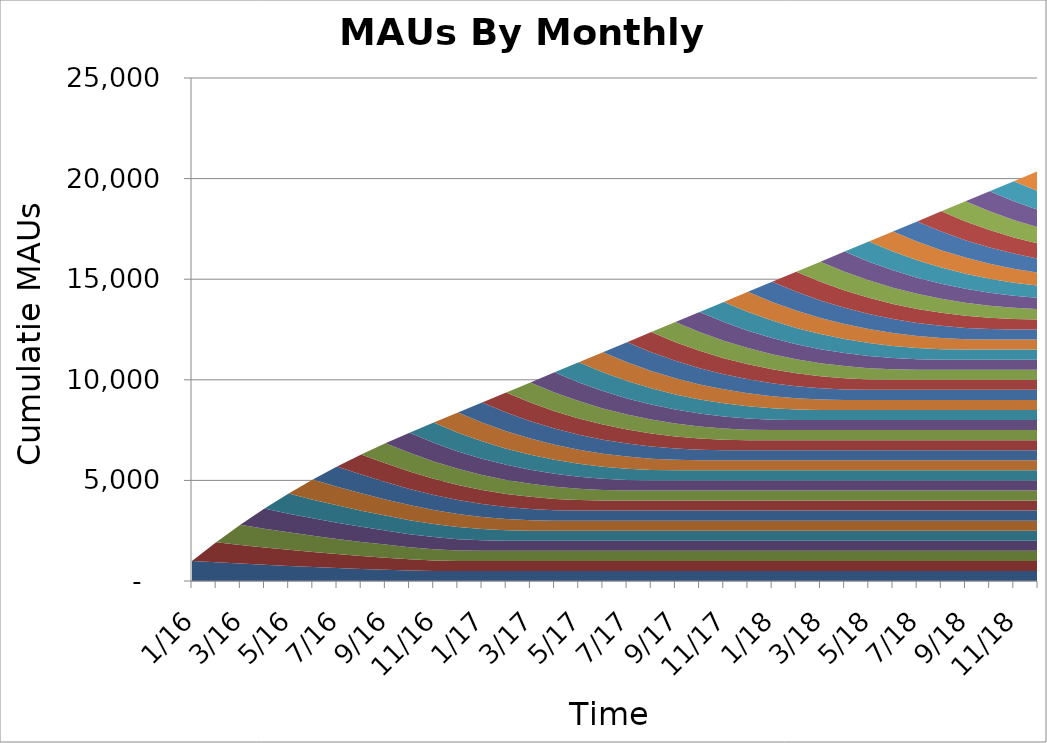
| Category | 1/1/16 | 2/1/16 | 3/1/16 | 4/1/16 | 5/1/16 | 6/1/16 | 7/1/16 | 8/1/16 | 9/1/16 | 10/1/16 | 11/1/16 | 12/1/16 | 1/1/17 | 2/1/17 | 3/1/17 | 4/1/17 | 5/1/17 | 6/1/17 | 7/1/17 | 8/1/17 | 9/1/17 | 10/1/17 | 11/1/17 | 12/1/17 | 1/1/18 | 2/1/18 | 3/1/18 | 4/1/18 | 5/1/18 | 6/1/18 | 7/1/18 | 8/1/18 | 9/1/18 | 10/1/18 | 11/1/18 | 12/1/18 | 1/1/19 | 2/1/19 | 3/1/19 | 4/1/19 | 5/1/19 | 6/1/19 | 7/1/19 | 8/1/19 | 9/1/19 | 10/1/19 | 11/1/19 | 12/1/19 | 1/1/20 | 2/1/20 | 3/1/20 | 4/1/20 | 5/1/20 | 6/1/20 | 7/1/20 | 8/1/20 | 9/1/20 | 10/1/20 | 11/1/20 | 12/1/20 | 1/1/21 | 2/1/21 | 3/1/21 | 4/1/21 | 5/1/21 | 6/1/21 | 7/1/21 | 8/1/21 | 9/1/21 | 10/1/21 | 11/1/21 | 12/1/21 | 1/1/22 | 2/1/22 | 3/1/22 | 4/1/22 | 5/1/22 | 6/1/22 | 7/1/22 | 8/1/22 | 9/1/22 | 10/1/22 | 11/1/22 | 12/1/22 |
|---|---|---|---|---|---|---|---|---|---|---|---|---|---|---|---|---|---|---|---|---|---|---|---|---|---|---|---|---|---|---|---|---|---|---|---|---|---|---|---|---|---|---|---|---|---|---|---|---|---|---|---|---|---|---|---|---|---|---|---|---|---|---|---|---|---|---|---|---|---|---|---|---|---|---|---|---|---|---|---|---|---|---|---|---|
| 2016-01-01 | 1000 | 0 | 0 | 0 | 0 | 0 | 0 | 0 | 0 | 0 | 0 | 0 | 0 | 0 | 0 | 0 | 0 | 0 | 0 | 0 | 0 | 0 | 0 | 0 | 0 | 0 | 0 | 0 | 0 | 0 | 0 | 0 | 0 | 0 | 0 | 0 | 0 | 0 | 0 | 0 | 0 | 0 | 0 | 0 | 0 | 0 | 0 | 0 | 0 | 0 | 0 | 0 | 0 | 0 | 0 | 0 | 0 | 0 | 0 | 0 | 0 | 0 | 0 | 0 | 0 | 0 | 0 | 0 | 0 | 0 | 0 | 0 | 0 | 0 | 0 | 0 | 0 | 0 | 0 | 0 | 0 | 0 | 0 | 0 |
| 2016-02-01 | 930 | 1000 | 0 | 0 | 0 | 0 | 0 | 0 | 0 | 0 | 0 | 0 | 0 | 0 | 0 | 0 | 0 | 0 | 0 | 0 | 0 | 0 | 0 | 0 | 0 | 0 | 0 | 0 | 0 | 0 | 0 | 0 | 0 | 0 | 0 | 0 | 0 | 0 | 0 | 0 | 0 | 0 | 0 | 0 | 0 | 0 | 0 | 0 | 0 | 0 | 0 | 0 | 0 | 0 | 0 | 0 | 0 | 0 | 0 | 0 | 0 | 0 | 0 | 0 | 0 | 0 | 0 | 0 | 0 | 0 | 0 | 0 | 0 | 0 | 0 | 0 | 0 | 0 | 0 | 0 | 0 | 0 | 0 | 0 |
| 2016-03-01 | 864.9 | 930 | 1000 | 0 | 0 | 0 | 0 | 0 | 0 | 0 | 0 | 0 | 0 | 0 | 0 | 0 | 0 | 0 | 0 | 0 | 0 | 0 | 0 | 0 | 0 | 0 | 0 | 0 | 0 | 0 | 0 | 0 | 0 | 0 | 0 | 0 | 0 | 0 | 0 | 0 | 0 | 0 | 0 | 0 | 0 | 0 | 0 | 0 | 0 | 0 | 0 | 0 | 0 | 0 | 0 | 0 | 0 | 0 | 0 | 0 | 0 | 0 | 0 | 0 | 0 | 0 | 0 | 0 | 0 | 0 | 0 | 0 | 0 | 0 | 0 | 0 | 0 | 0 | 0 | 0 | 0 | 0 | 0 | 0 |
| 2016-04-01 | 804.357 | 864.9 | 930 | 1000 | 0 | 0 | 0 | 0 | 0 | 0 | 0 | 0 | 0 | 0 | 0 | 0 | 0 | 0 | 0 | 0 | 0 | 0 | 0 | 0 | 0 | 0 | 0 | 0 | 0 | 0 | 0 | 0 | 0 | 0 | 0 | 0 | 0 | 0 | 0 | 0 | 0 | 0 | 0 | 0 | 0 | 0 | 0 | 0 | 0 | 0 | 0 | 0 | 0 | 0 | 0 | 0 | 0 | 0 | 0 | 0 | 0 | 0 | 0 | 0 | 0 | 0 | 0 | 0 | 0 | 0 | 0 | 0 | 0 | 0 | 0 | 0 | 0 | 0 | 0 | 0 | 0 | 0 | 0 | 0 |
| 2016-05-01 | 748.052 | 804.357 | 864.9 | 930 | 1000 | 0 | 0 | 0 | 0 | 0 | 0 | 0 | 0 | 0 | 0 | 0 | 0 | 0 | 0 | 0 | 0 | 0 | 0 | 0 | 0 | 0 | 0 | 0 | 0 | 0 | 0 | 0 | 0 | 0 | 0 | 0 | 0 | 0 | 0 | 0 | 0 | 0 | 0 | 0 | 0 | 0 | 0 | 0 | 0 | 0 | 0 | 0 | 0 | 0 | 0 | 0 | 0 | 0 | 0 | 0 | 0 | 0 | 0 | 0 | 0 | 0 | 0 | 0 | 0 | 0 | 0 | 0 | 0 | 0 | 0 | 0 | 0 | 0 | 0 | 0 | 0 | 0 | 0 | 0 |
| 2016-06-01 | 695.688 | 748.052 | 804.357 | 864.9 | 930 | 1000 | 0 | 0 | 0 | 0 | 0 | 0 | 0 | 0 | 0 | 0 | 0 | 0 | 0 | 0 | 0 | 0 | 0 | 0 | 0 | 0 | 0 | 0 | 0 | 0 | 0 | 0 | 0 | 0 | 0 | 0 | 0 | 0 | 0 | 0 | 0 | 0 | 0 | 0 | 0 | 0 | 0 | 0 | 0 | 0 | 0 | 0 | 0 | 0 | 0 | 0 | 0 | 0 | 0 | 0 | 0 | 0 | 0 | 0 | 0 | 0 | 0 | 0 | 0 | 0 | 0 | 0 | 0 | 0 | 0 | 0 | 0 | 0 | 0 | 0 | 0 | 0 | 0 | 0 |
| 2016-07-01 | 646.99 | 695.688 | 748.052 | 804.357 | 864.9 | 930 | 1000 | 0 | 0 | 0 | 0 | 0 | 0 | 0 | 0 | 0 | 0 | 0 | 0 | 0 | 0 | 0 | 0 | 0 | 0 | 0 | 0 | 0 | 0 | 0 | 0 | 0 | 0 | 0 | 0 | 0 | 0 | 0 | 0 | 0 | 0 | 0 | 0 | 0 | 0 | 0 | 0 | 0 | 0 | 0 | 0 | 0 | 0 | 0 | 0 | 0 | 0 | 0 | 0 | 0 | 0 | 0 | 0 | 0 | 0 | 0 | 0 | 0 | 0 | 0 | 0 | 0 | 0 | 0 | 0 | 0 | 0 | 0 | 0 | 0 | 0 | 0 | 0 | 0 |
| 2016-08-01 | 601.701 | 646.99 | 695.688 | 748.052 | 804.357 | 864.9 | 930 | 1000 | 0 | 0 | 0 | 0 | 0 | 0 | 0 | 0 | 0 | 0 | 0 | 0 | 0 | 0 | 0 | 0 | 0 | 0 | 0 | 0 | 0 | 0 | 0 | 0 | 0 | 0 | 0 | 0 | 0 | 0 | 0 | 0 | 0 | 0 | 0 | 0 | 0 | 0 | 0 | 0 | 0 | 0 | 0 | 0 | 0 | 0 | 0 | 0 | 0 | 0 | 0 | 0 | 0 | 0 | 0 | 0 | 0 | 0 | 0 | 0 | 0 | 0 | 0 | 0 | 0 | 0 | 0 | 0 | 0 | 0 | 0 | 0 | 0 | 0 | 0 | 0 |
| 2016-09-01 | 559.582 | 601.701 | 646.99 | 695.688 | 748.052 | 804.357 | 864.9 | 930 | 1000 | 0 | 0 | 0 | 0 | 0 | 0 | 0 | 0 | 0 | 0 | 0 | 0 | 0 | 0 | 0 | 0 | 0 | 0 | 0 | 0 | 0 | 0 | 0 | 0 | 0 | 0 | 0 | 0 | 0 | 0 | 0 | 0 | 0 | 0 | 0 | 0 | 0 | 0 | 0 | 0 | 0 | 0 | 0 | 0 | 0 | 0 | 0 | 0 | 0 | 0 | 0 | 0 | 0 | 0 | 0 | 0 | 0 | 0 | 0 | 0 | 0 | 0 | 0 | 0 | 0 | 0 | 0 | 0 | 0 | 0 | 0 | 0 | 0 | 0 | 0 |
| 2016-10-01 | 520.411 | 559.582 | 601.701 | 646.99 | 695.688 | 748.052 | 804.357 | 864.9 | 930 | 1000 | 0 | 0 | 0 | 0 | 0 | 0 | 0 | 0 | 0 | 0 | 0 | 0 | 0 | 0 | 0 | 0 | 0 | 0 | 0 | 0 | 0 | 0 | 0 | 0 | 0 | 0 | 0 | 0 | 0 | 0 | 0 | 0 | 0 | 0 | 0 | 0 | 0 | 0 | 0 | 0 | 0 | 0 | 0 | 0 | 0 | 0 | 0 | 0 | 0 | 0 | 0 | 0 | 0 | 0 | 0 | 0 | 0 | 0 | 0 | 0 | 0 | 0 | 0 | 0 | 0 | 0 | 0 | 0 | 0 | 0 | 0 | 0 | 0 | 0 |
| 2016-11-01 | 500 | 520.411 | 559.582 | 601.701 | 646.99 | 695.688 | 748.052 | 804.357 | 864.9 | 930 | 1000 | 0 | 0 | 0 | 0 | 0 | 0 | 0 | 0 | 0 | 0 | 0 | 0 | 0 | 0 | 0 | 0 | 0 | 0 | 0 | 0 | 0 | 0 | 0 | 0 | 0 | 0 | 0 | 0 | 0 | 0 | 0 | 0 | 0 | 0 | 0 | 0 | 0 | 0 | 0 | 0 | 0 | 0 | 0 | 0 | 0 | 0 | 0 | 0 | 0 | 0 | 0 | 0 | 0 | 0 | 0 | 0 | 0 | 0 | 0 | 0 | 0 | 0 | 0 | 0 | 0 | 0 | 0 | 0 | 0 | 0 | 0 | 0 | 0 |
| 2016-12-01 | 500 | 500 | 520.411 | 559.582 | 601.701 | 646.99 | 695.688 | 748.052 | 804.357 | 864.9 | 930 | 1000 | 0 | 0 | 0 | 0 | 0 | 0 | 0 | 0 | 0 | 0 | 0 | 0 | 0 | 0 | 0 | 0 | 0 | 0 | 0 | 0 | 0 | 0 | 0 | 0 | 0 | 0 | 0 | 0 | 0 | 0 | 0 | 0 | 0 | 0 | 0 | 0 | 0 | 0 | 0 | 0 | 0 | 0 | 0 | 0 | 0 | 0 | 0 | 0 | 0 | 0 | 0 | 0 | 0 | 0 | 0 | 0 | 0 | 0 | 0 | 0 | 0 | 0 | 0 | 0 | 0 | 0 | 0 | 0 | 0 | 0 | 0 | 0 |
| 2017-01-01 | 500 | 500 | 500 | 520.411 | 559.582 | 601.701 | 646.99 | 695.688 | 748.052 | 804.357 | 864.9 | 930 | 1000 | 0 | 0 | 0 | 0 | 0 | 0 | 0 | 0 | 0 | 0 | 0 | 0 | 0 | 0 | 0 | 0 | 0 | 0 | 0 | 0 | 0 | 0 | 0 | 0 | 0 | 0 | 0 | 0 | 0 | 0 | 0 | 0 | 0 | 0 | 0 | 0 | 0 | 0 | 0 | 0 | 0 | 0 | 0 | 0 | 0 | 0 | 0 | 0 | 0 | 0 | 0 | 0 | 0 | 0 | 0 | 0 | 0 | 0 | 0 | 0 | 0 | 0 | 0 | 0 | 0 | 0 | 0 | 0 | 0 | 0 | 0 |
| 2017-02-01 | 500 | 500 | 500 | 500 | 520.411 | 559.582 | 601.701 | 646.99 | 695.688 | 748.052 | 804.357 | 864.9 | 930 | 1000 | 0 | 0 | 0 | 0 | 0 | 0 | 0 | 0 | 0 | 0 | 0 | 0 | 0 | 0 | 0 | 0 | 0 | 0 | 0 | 0 | 0 | 0 | 0 | 0 | 0 | 0 | 0 | 0 | 0 | 0 | 0 | 0 | 0 | 0 | 0 | 0 | 0 | 0 | 0 | 0 | 0 | 0 | 0 | 0 | 0 | 0 | 0 | 0 | 0 | 0 | 0 | 0 | 0 | 0 | 0 | 0 | 0 | 0 | 0 | 0 | 0 | 0 | 0 | 0 | 0 | 0 | 0 | 0 | 0 | 0 |
| 2017-03-01 | 500 | 500 | 500 | 500 | 500 | 520.411 | 559.582 | 601.701 | 646.99 | 695.688 | 748.052 | 804.357 | 864.9 | 930 | 1000 | 0 | 0 | 0 | 0 | 0 | 0 | 0 | 0 | 0 | 0 | 0 | 0 | 0 | 0 | 0 | 0 | 0 | 0 | 0 | 0 | 0 | 0 | 0 | 0 | 0 | 0 | 0 | 0 | 0 | 0 | 0 | 0 | 0 | 0 | 0 | 0 | 0 | 0 | 0 | 0 | 0 | 0 | 0 | 0 | 0 | 0 | 0 | 0 | 0 | 0 | 0 | 0 | 0 | 0 | 0 | 0 | 0 | 0 | 0 | 0 | 0 | 0 | 0 | 0 | 0 | 0 | 0 | 0 | 0 |
| 2017-04-01 | 500 | 500 | 500 | 500 | 500 | 500 | 520.411 | 559.582 | 601.701 | 646.99 | 695.688 | 748.052 | 804.357 | 864.9 | 930 | 1000 | 0 | 0 | 0 | 0 | 0 | 0 | 0 | 0 | 0 | 0 | 0 | 0 | 0 | 0 | 0 | 0 | 0 | 0 | 0 | 0 | 0 | 0 | 0 | 0 | 0 | 0 | 0 | 0 | 0 | 0 | 0 | 0 | 0 | 0 | 0 | 0 | 0 | 0 | 0 | 0 | 0 | 0 | 0 | 0 | 0 | 0 | 0 | 0 | 0 | 0 | 0 | 0 | 0 | 0 | 0 | 0 | 0 | 0 | 0 | 0 | 0 | 0 | 0 | 0 | 0 | 0 | 0 | 0 |
| 2017-05-01 | 500 | 500 | 500 | 500 | 500 | 500 | 500 | 520.411 | 559.582 | 601.701 | 646.99 | 695.688 | 748.052 | 804.357 | 864.9 | 930 | 1000 | 0 | 0 | 0 | 0 | 0 | 0 | 0 | 0 | 0 | 0 | 0 | 0 | 0 | 0 | 0 | 0 | 0 | 0 | 0 | 0 | 0 | 0 | 0 | 0 | 0 | 0 | 0 | 0 | 0 | 0 | 0 | 0 | 0 | 0 | 0 | 0 | 0 | 0 | 0 | 0 | 0 | 0 | 0 | 0 | 0 | 0 | 0 | 0 | 0 | 0 | 0 | 0 | 0 | 0 | 0 | 0 | 0 | 0 | 0 | 0 | 0 | 0 | 0 | 0 | 0 | 0 | 0 |
| 2017-06-01 | 500 | 500 | 500 | 500 | 500 | 500 | 500 | 500 | 520.411 | 559.582 | 601.701 | 646.99 | 695.688 | 748.052 | 804.357 | 864.9 | 930 | 1000 | 0 | 0 | 0 | 0 | 0 | 0 | 0 | 0 | 0 | 0 | 0 | 0 | 0 | 0 | 0 | 0 | 0 | 0 | 0 | 0 | 0 | 0 | 0 | 0 | 0 | 0 | 0 | 0 | 0 | 0 | 0 | 0 | 0 | 0 | 0 | 0 | 0 | 0 | 0 | 0 | 0 | 0 | 0 | 0 | 0 | 0 | 0 | 0 | 0 | 0 | 0 | 0 | 0 | 0 | 0 | 0 | 0 | 0 | 0 | 0 | 0 | 0 | 0 | 0 | 0 | 0 |
| 2017-07-01 | 500 | 500 | 500 | 500 | 500 | 500 | 500 | 500 | 500 | 520.411 | 559.582 | 601.701 | 646.99 | 695.688 | 748.052 | 804.357 | 864.9 | 930 | 1000 | 0 | 0 | 0 | 0 | 0 | 0 | 0 | 0 | 0 | 0 | 0 | 0 | 0 | 0 | 0 | 0 | 0 | 0 | 0 | 0 | 0 | 0 | 0 | 0 | 0 | 0 | 0 | 0 | 0 | 0 | 0 | 0 | 0 | 0 | 0 | 0 | 0 | 0 | 0 | 0 | 0 | 0 | 0 | 0 | 0 | 0 | 0 | 0 | 0 | 0 | 0 | 0 | 0 | 0 | 0 | 0 | 0 | 0 | 0 | 0 | 0 | 0 | 0 | 0 | 0 |
| 2017-08-01 | 500 | 500 | 500 | 500 | 500 | 500 | 500 | 500 | 500 | 500 | 520.411 | 559.582 | 601.701 | 646.99 | 695.688 | 748.052 | 804.357 | 864.9 | 930 | 1000 | 0 | 0 | 0 | 0 | 0 | 0 | 0 | 0 | 0 | 0 | 0 | 0 | 0 | 0 | 0 | 0 | 0 | 0 | 0 | 0 | 0 | 0 | 0 | 0 | 0 | 0 | 0 | 0 | 0 | 0 | 0 | 0 | 0 | 0 | 0 | 0 | 0 | 0 | 0 | 0 | 0 | 0 | 0 | 0 | 0 | 0 | 0 | 0 | 0 | 0 | 0 | 0 | 0 | 0 | 0 | 0 | 0 | 0 | 0 | 0 | 0 | 0 | 0 | 0 |
| 2017-09-01 | 500 | 500 | 500 | 500 | 500 | 500 | 500 | 500 | 500 | 500 | 500 | 520.411 | 559.582 | 601.701 | 646.99 | 695.688 | 748.052 | 804.357 | 864.9 | 930 | 1000 | 0 | 0 | 0 | 0 | 0 | 0 | 0 | 0 | 0 | 0 | 0 | 0 | 0 | 0 | 0 | 0 | 0 | 0 | 0 | 0 | 0 | 0 | 0 | 0 | 0 | 0 | 0 | 0 | 0 | 0 | 0 | 0 | 0 | 0 | 0 | 0 | 0 | 0 | 0 | 0 | 0 | 0 | 0 | 0 | 0 | 0 | 0 | 0 | 0 | 0 | 0 | 0 | 0 | 0 | 0 | 0 | 0 | 0 | 0 | 0 | 0 | 0 | 0 |
| 2017-10-01 | 500 | 500 | 500 | 500 | 500 | 500 | 500 | 500 | 500 | 500 | 500 | 500 | 520.411 | 559.582 | 601.701 | 646.99 | 695.688 | 748.052 | 804.357 | 864.9 | 930 | 1000 | 0 | 0 | 0 | 0 | 0 | 0 | 0 | 0 | 0 | 0 | 0 | 0 | 0 | 0 | 0 | 0 | 0 | 0 | 0 | 0 | 0 | 0 | 0 | 0 | 0 | 0 | 0 | 0 | 0 | 0 | 0 | 0 | 0 | 0 | 0 | 0 | 0 | 0 | 0 | 0 | 0 | 0 | 0 | 0 | 0 | 0 | 0 | 0 | 0 | 0 | 0 | 0 | 0 | 0 | 0 | 0 | 0 | 0 | 0 | 0 | 0 | 0 |
| 2017-11-01 | 500 | 500 | 500 | 500 | 500 | 500 | 500 | 500 | 500 | 500 | 500 | 500 | 500 | 520.411 | 559.582 | 601.701 | 646.99 | 695.688 | 748.052 | 804.357 | 864.9 | 930 | 1000 | 0 | 0 | 0 | 0 | 0 | 0 | 0 | 0 | 0 | 0 | 0 | 0 | 0 | 0 | 0 | 0 | 0 | 0 | 0 | 0 | 0 | 0 | 0 | 0 | 0 | 0 | 0 | 0 | 0 | 0 | 0 | 0 | 0 | 0 | 0 | 0 | 0 | 0 | 0 | 0 | 0 | 0 | 0 | 0 | 0 | 0 | 0 | 0 | 0 | 0 | 0 | 0 | 0 | 0 | 0 | 0 | 0 | 0 | 0 | 0 | 0 |
| 2017-12-01 | 500 | 500 | 500 | 500 | 500 | 500 | 500 | 500 | 500 | 500 | 500 | 500 | 500 | 500 | 520.411 | 559.582 | 601.701 | 646.99 | 695.688 | 748.052 | 804.357 | 864.9 | 930 | 1000 | 0 | 0 | 0 | 0 | 0 | 0 | 0 | 0 | 0 | 0 | 0 | 0 | 0 | 0 | 0 | 0 | 0 | 0 | 0 | 0 | 0 | 0 | 0 | 0 | 0 | 0 | 0 | 0 | 0 | 0 | 0 | 0 | 0 | 0 | 0 | 0 | 0 | 0 | 0 | 0 | 0 | 0 | 0 | 0 | 0 | 0 | 0 | 0 | 0 | 0 | 0 | 0 | 0 | 0 | 0 | 0 | 0 | 0 | 0 | 0 |
| 2018-01-01 | 500 | 500 | 500 | 500 | 500 | 500 | 500 | 500 | 500 | 500 | 500 | 500 | 500 | 500 | 500 | 520.411 | 559.582 | 601.701 | 646.99 | 695.688 | 748.052 | 804.357 | 864.9 | 930 | 1000 | 0 | 0 | 0 | 0 | 0 | 0 | 0 | 0 | 0 | 0 | 0 | 0 | 0 | 0 | 0 | 0 | 0 | 0 | 0 | 0 | 0 | 0 | 0 | 0 | 0 | 0 | 0 | 0 | 0 | 0 | 0 | 0 | 0 | 0 | 0 | 0 | 0 | 0 | 0 | 0 | 0 | 0 | 0 | 0 | 0 | 0 | 0 | 0 | 0 | 0 | 0 | 0 | 0 | 0 | 0 | 0 | 0 | 0 | 0 |
| 2018-02-01 | 500 | 500 | 500 | 500 | 500 | 500 | 500 | 500 | 500 | 500 | 500 | 500 | 500 | 500 | 500 | 500 | 520.411 | 559.582 | 601.701 | 646.99 | 695.688 | 748.052 | 804.357 | 864.9 | 930 | 1000 | 0 | 0 | 0 | 0 | 0 | 0 | 0 | 0 | 0 | 0 | 0 | 0 | 0 | 0 | 0 | 0 | 0 | 0 | 0 | 0 | 0 | 0 | 0 | 0 | 0 | 0 | 0 | 0 | 0 | 0 | 0 | 0 | 0 | 0 | 0 | 0 | 0 | 0 | 0 | 0 | 0 | 0 | 0 | 0 | 0 | 0 | 0 | 0 | 0 | 0 | 0 | 0 | 0 | 0 | 0 | 0 | 0 | 0 |
| 2018-03-01 | 500 | 500 | 500 | 500 | 500 | 500 | 500 | 500 | 500 | 500 | 500 | 500 | 500 | 500 | 500 | 500 | 500 | 520.411 | 559.582 | 601.701 | 646.99 | 695.688 | 748.052 | 804.357 | 864.9 | 930 | 1000 | 0 | 0 | 0 | 0 | 0 | 0 | 0 | 0 | 0 | 0 | 0 | 0 | 0 | 0 | 0 | 0 | 0 | 0 | 0 | 0 | 0 | 0 | 0 | 0 | 0 | 0 | 0 | 0 | 0 | 0 | 0 | 0 | 0 | 0 | 0 | 0 | 0 | 0 | 0 | 0 | 0 | 0 | 0 | 0 | 0 | 0 | 0 | 0 | 0 | 0 | 0 | 0 | 0 | 0 | 0 | 0 | 0 |
| 2018-04-01 | 500 | 500 | 500 | 500 | 500 | 500 | 500 | 500 | 500 | 500 | 500 | 500 | 500 | 500 | 500 | 500 | 500 | 500 | 520.411 | 559.582 | 601.701 | 646.99 | 695.688 | 748.052 | 804.357 | 864.9 | 930 | 1000 | 0 | 0 | 0 | 0 | 0 | 0 | 0 | 0 | 0 | 0 | 0 | 0 | 0 | 0 | 0 | 0 | 0 | 0 | 0 | 0 | 0 | 0 | 0 | 0 | 0 | 0 | 0 | 0 | 0 | 0 | 0 | 0 | 0 | 0 | 0 | 0 | 0 | 0 | 0 | 0 | 0 | 0 | 0 | 0 | 0 | 0 | 0 | 0 | 0 | 0 | 0 | 0 | 0 | 0 | 0 | 0 |
| 2018-05-01 | 500 | 500 | 500 | 500 | 500 | 500 | 500 | 500 | 500 | 500 | 500 | 500 | 500 | 500 | 500 | 500 | 500 | 500 | 500 | 520.411 | 559.582 | 601.701 | 646.99 | 695.688 | 748.052 | 804.357 | 864.9 | 930 | 1000 | 0 | 0 | 0 | 0 | 0 | 0 | 0 | 0 | 0 | 0 | 0 | 0 | 0 | 0 | 0 | 0 | 0 | 0 | 0 | 0 | 0 | 0 | 0 | 0 | 0 | 0 | 0 | 0 | 0 | 0 | 0 | 0 | 0 | 0 | 0 | 0 | 0 | 0 | 0 | 0 | 0 | 0 | 0 | 0 | 0 | 0 | 0 | 0 | 0 | 0 | 0 | 0 | 0 | 0 | 0 |
| 2018-06-01 | 500 | 500 | 500 | 500 | 500 | 500 | 500 | 500 | 500 | 500 | 500 | 500 | 500 | 500 | 500 | 500 | 500 | 500 | 500 | 500 | 520.411 | 559.582 | 601.701 | 646.99 | 695.688 | 748.052 | 804.357 | 864.9 | 930 | 1000 | 0 | 0 | 0 | 0 | 0 | 0 | 0 | 0 | 0 | 0 | 0 | 0 | 0 | 0 | 0 | 0 | 0 | 0 | 0 | 0 | 0 | 0 | 0 | 0 | 0 | 0 | 0 | 0 | 0 | 0 | 0 | 0 | 0 | 0 | 0 | 0 | 0 | 0 | 0 | 0 | 0 | 0 | 0 | 0 | 0 | 0 | 0 | 0 | 0 | 0 | 0 | 0 | 0 | 0 |
| 2018-07-01 | 500 | 500 | 500 | 500 | 500 | 500 | 500 | 500 | 500 | 500 | 500 | 500 | 500 | 500 | 500 | 500 | 500 | 500 | 500 | 500 | 500 | 520.411 | 559.582 | 601.701 | 646.99 | 695.688 | 748.052 | 804.357 | 864.9 | 930 | 1000 | 0 | 0 | 0 | 0 | 0 | 0 | 0 | 0 | 0 | 0 | 0 | 0 | 0 | 0 | 0 | 0 | 0 | 0 | 0 | 0 | 0 | 0 | 0 | 0 | 0 | 0 | 0 | 0 | 0 | 0 | 0 | 0 | 0 | 0 | 0 | 0 | 0 | 0 | 0 | 0 | 0 | 0 | 0 | 0 | 0 | 0 | 0 | 0 | 0 | 0 | 0 | 0 | 0 |
| 2018-08-01 | 500 | 500 | 500 | 500 | 500 | 500 | 500 | 500 | 500 | 500 | 500 | 500 | 500 | 500 | 500 | 500 | 500 | 500 | 500 | 500 | 500 | 500 | 520.411 | 559.582 | 601.701 | 646.99 | 695.688 | 748.052 | 804.357 | 864.9 | 930 | 1000 | 0 | 0 | 0 | 0 | 0 | 0 | 0 | 0 | 0 | 0 | 0 | 0 | 0 | 0 | 0 | 0 | 0 | 0 | 0 | 0 | 0 | 0 | 0 | 0 | 0 | 0 | 0 | 0 | 0 | 0 | 0 | 0 | 0 | 0 | 0 | 0 | 0 | 0 | 0 | 0 | 0 | 0 | 0 | 0 | 0 | 0 | 0 | 0 | 0 | 0 | 0 | 0 |
| 2018-09-01 | 500 | 500 | 500 | 500 | 500 | 500 | 500 | 500 | 500 | 500 | 500 | 500 | 500 | 500 | 500 | 500 | 500 | 500 | 500 | 500 | 500 | 500 | 500 | 520.411 | 559.582 | 601.701 | 646.99 | 695.688 | 748.052 | 804.357 | 864.9 | 930 | 1000 | 0 | 0 | 0 | 0 | 0 | 0 | 0 | 0 | 0 | 0 | 0 | 0 | 0 | 0 | 0 | 0 | 0 | 0 | 0 | 0 | 0 | 0 | 0 | 0 | 0 | 0 | 0 | 0 | 0 | 0 | 0 | 0 | 0 | 0 | 0 | 0 | 0 | 0 | 0 | 0 | 0 | 0 | 0 | 0 | 0 | 0 | 0 | 0 | 0 | 0 | 0 |
| 2018-10-01 | 500 | 500 | 500 | 500 | 500 | 500 | 500 | 500 | 500 | 500 | 500 | 500 | 500 | 500 | 500 | 500 | 500 | 500 | 500 | 500 | 500 | 500 | 500 | 500 | 520.411 | 559.582 | 601.701 | 646.99 | 695.688 | 748.052 | 804.357 | 864.9 | 930 | 1000 | 0 | 0 | 0 | 0 | 0 | 0 | 0 | 0 | 0 | 0 | 0 | 0 | 0 | 0 | 0 | 0 | 0 | 0 | 0 | 0 | 0 | 0 | 0 | 0 | 0 | 0 | 0 | 0 | 0 | 0 | 0 | 0 | 0 | 0 | 0 | 0 | 0 | 0 | 0 | 0 | 0 | 0 | 0 | 0 | 0 | 0 | 0 | 0 | 0 | 0 |
| 2018-11-01 | 500 | 500 | 500 | 500 | 500 | 500 | 500 | 500 | 500 | 500 | 500 | 500 | 500 | 500 | 500 | 500 | 500 | 500 | 500 | 500 | 500 | 500 | 500 | 500 | 500 | 520.411 | 559.582 | 601.701 | 646.99 | 695.688 | 748.052 | 804.357 | 864.9 | 930 | 1000 | 0 | 0 | 0 | 0 | 0 | 0 | 0 | 0 | 0 | 0 | 0 | 0 | 0 | 0 | 0 | 0 | 0 | 0 | 0 | 0 | 0 | 0 | 0 | 0 | 0 | 0 | 0 | 0 | 0 | 0 | 0 | 0 | 0 | 0 | 0 | 0 | 0 | 0 | 0 | 0 | 0 | 0 | 0 | 0 | 0 | 0 | 0 | 0 | 0 |
| 2018-12-01 | 500 | 500 | 500 | 500 | 500 | 500 | 500 | 500 | 500 | 500 | 500 | 500 | 500 | 500 | 500 | 500 | 500 | 500 | 500 | 500 | 500 | 500 | 500 | 500 | 500 | 500 | 520.411 | 559.582 | 601.701 | 646.99 | 695.688 | 748.052 | 804.357 | 864.9 | 930 | 1000 | 0 | 0 | 0 | 0 | 0 | 0 | 0 | 0 | 0 | 0 | 0 | 0 | 0 | 0 | 0 | 0 | 0 | 0 | 0 | 0 | 0 | 0 | 0 | 0 | 0 | 0 | 0 | 0 | 0 | 0 | 0 | 0 | 0 | 0 | 0 | 0 | 0 | 0 | 0 | 0 | 0 | 0 | 0 | 0 | 0 | 0 | 0 | 0 |